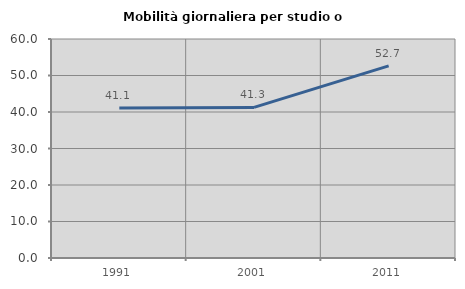
| Category | Mobilità giornaliera per studio o lavoro |
|---|---|
| 1991.0 | 41.096 |
| 2001.0 | 41.259 |
| 2011.0 | 52.65 |